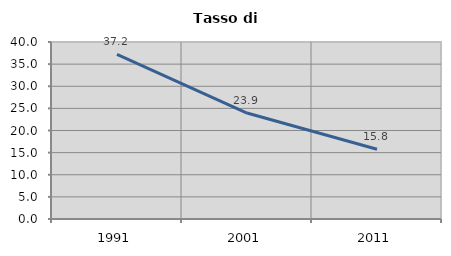
| Category | Tasso di disoccupazione   |
|---|---|
| 1991.0 | 37.178 |
| 2001.0 | 23.946 |
| 2011.0 | 15.756 |